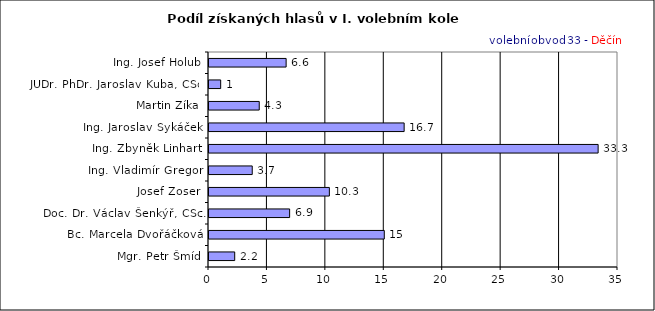
| Category | Series 0 |
|---|---|
| Mgr. Petr Šmíd | 2.2 |
| Bc. Marcela Dvořáčková | 15 |
| Doc. Dr. Václav Šenkýř, CSc. | 6.9 |
| Josef Zoser | 10.3 |
| Ing. Vladimír Gregor | 3.7 |
| Ing. Zbyněk Linhart | 33.3 |
| Ing. Jaroslav Sykáček | 16.7 |
| Martin Zíka | 4.3 |
| JUDr. PhDr. Jaroslav Kuba, CSc. | 1 |
| Ing. Josef Holub | 6.6 |